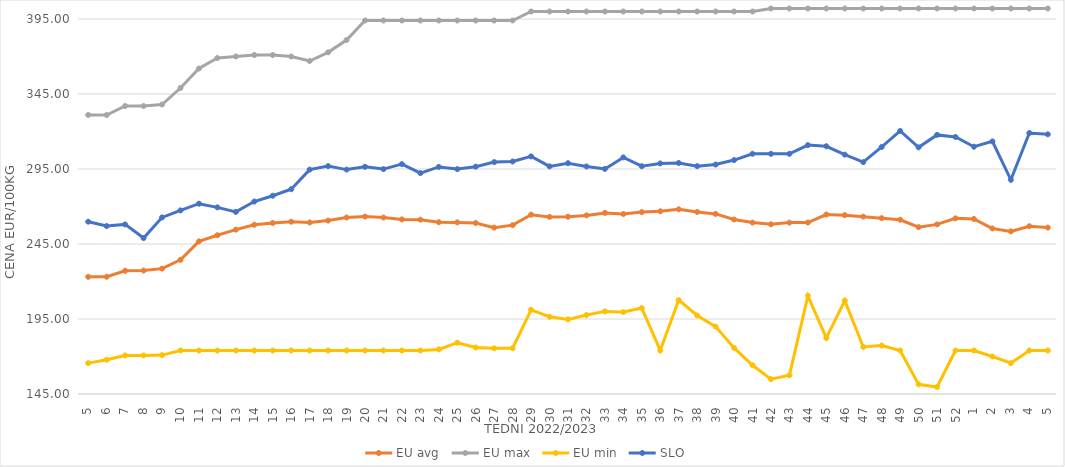
| Category | EU avg | EU max | EU min | SLO |
|---|---|---|---|---|
| 5.0 | 223.143 | 331 | 165.59 | 259.87 |
| 6.0 | 223.178 | 331 | 167.86 | 256.97 |
| 7.0 | 227.145 | 337 | 170.719 | 258.07 |
| 8.0 | 227.312 | 337 | 170.743 | 248.97 |
| 9.0 | 228.588 | 338 | 170.92 | 262.72 |
| 10.0 | 234.434 | 349 | 174 | 267.38 |
| 11.0 | 246.762 | 362 | 174 | 271.86 |
| 12.0 | 250.845 | 369 | 174 | 269.43 |
| 13.0 | 254.568 | 370 | 174 | 266.39 |
| 14.0 | 257.819 | 371 | 174 | 273.3 |
| 15.0 | 259 | 371 | 174 | 277.18 |
| 16.0 | 259.873 | 370 | 174 | 281.55 |
| 17.0 | 259.351 | 367 | 174 | 294.59 |
| 18.0 | 260.6 | 372.758 | 174 | 296.93 |
| 19.0 | 262.669 | 381 | 174 | 294.6 |
| 20.0 | 263.291 | 394 | 174 | 296.48 |
| 21.0 | 262.64 | 394 | 174 | 294.94 |
| 22.0 | 261.388 | 394 | 174 | 298.26 |
| 23.0 | 261.228 | 394 | 174 | 292.27 |
| 24.0 | 259.544 | 394 | 174.72 | 296.39 |
| 25.0 | 259.395 | 394 | 179.2 | 294.93 |
| 26.0 | 259.018 | 394 | 176 | 296.56 |
| 27.0 | 255.922 | 394 | 175.451 | 299.59 |
| 28.0 | 257.564 | 394 | 175.52 | 300.01 |
| 29.0 | 264.52 | 400 | 201.097 | 303.41 |
| 30.0 | 263.067 | 400 | 196.496 | 296.73 |
| 31.0 | 263.196 | 400 | 194.756 | 298.88 |
| 32.0 | 264.059 | 400 | 197.634 | 296.7 |
| 33.0 | 265.729 | 400 | 200.07 | 295.05 |
| 34.0 | 265.016 | 400 | 199.637 | 302.73 |
| 35.0 | 266.273 | 400 | 202.277 | 296.86 |
| 36.0 | 266.807 | 400 | 174 | 298.7 |
| 37.0 | 268.136 | 400 | 207.594 | 299.02 |
| 38.0 | 266.39 | 400 | 197.352 | 296.91 |
| 39.0 | 265.059 | 400 | 189.926 | 297.96 |
| 40.0 | 261.35 | 400 | 175.723 | 300.95 |
| 41.0 | 259.271 | 400 | 164.165 | 305.13 |
| 42.0 | 258.146 | 402 | 154.869 | 305.13 |
| 43.0 | 259.256 | 402 | 157.459 | 305.13 |
| 44.0 | 259.32 | 402 | 210.415 | 310.93 |
| 45.0 | 264.649 | 402 | 182.35 | 310.16 |
| 46.0 | 264.228 | 402 | 207.247 | 304.58 |
| 47.0 | 263.24 | 402 | 176.378 | 299.59 |
| 48.0 | 262.225 | 402 | 177.332 | 309.69 |
| 49.0 | 261.152 | 402 | 174 | 320.38 |
| 50.0 | 256.24 | 402 | 151.434 | 309.44 |
| 51.0 | 258.071 | 402 | 149.638 | 317.74 |
| 52.0 | 262.088 | 402 | 174 | 316.36 |
| 1.0 | 261.691 | 402 | 174 | 309.84 |
| 2.0 | 255.336 | 402 | 169.983 | 313.4 |
| 3.0 | 253.404 | 402 | 165.574 | 287.81 |
| 4.0 | 256.851 | 402 | 174 | 318.98 |
| 5.0 | 255.941 | 402 | 174 | 318.13 |